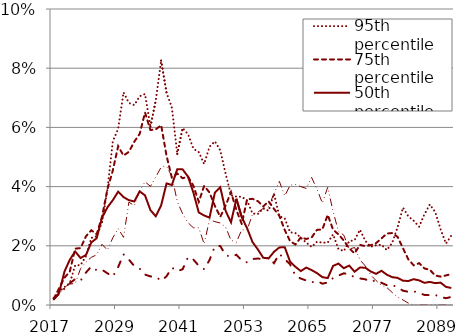
| Category | 95th percentile | 75th percentile | 50th percentile | 25th percentile | 5th percentile |
|---|---|---|---|---|---|
| 2017.0 | 0.002 | 0.002 | 0.002 | 0.002 | 0.002 |
| 2018.0 | 0.004 | 0.006 | 0.004 | 0.004 | 0.004 |
| 2019.0 | 0.006 | 0.009 | 0.011 | 0.006 | 0.006 |
| 2020.0 | 0.007 | 0.011 | 0.015 | 0.007 | 0.007 |
| 2021.0 | 0.013 | 0.019 | 0.018 | 0.009 | 0.007 |
| 2022.0 | 0.013 | 0.019 | 0.016 | 0.008 | 0.012 |
| 2023.0 | 0.016 | 0.023 | 0.017 | 0.011 | 0.014 |
| 2024.0 | 0.023 | 0.025 | 0.021 | 0.013 | 0.016 |
| 2025.0 | 0.023 | 0.024 | 0.023 | 0.012 | 0.017 |
| 2026.0 | 0.028 | 0.03 | 0.03 | 0.012 | 0.021 |
| 2027.0 | 0.039 | 0.039 | 0.033 | 0.011 | 0.019 |
| 2028.0 | 0.055 | 0.045 | 0.035 | 0.01 | 0.023 |
| 2029.0 | 0.06 | 0.054 | 0.038 | 0.013 | 0.026 |
| 2030.0 | 0.072 | 0.05 | 0.036 | 0.017 | 0.023 |
| 2031.0 | 0.068 | 0.052 | 0.035 | 0.015 | 0.035 |
| 2032.0 | 0.068 | 0.055 | 0.035 | 0.013 | 0.034 |
| 2033.0 | 0.071 | 0.058 | 0.038 | 0.012 | 0.039 |
| 2034.0 | 0.071 | 0.065 | 0.037 | 0.01 | 0.042 |
| 2035.0 | 0.06 | 0.059 | 0.032 | 0.01 | 0.04 |
| 2036.0 | 0.069 | 0.059 | 0.03 | 0.01 | 0.043 |
| 2037.0 | 0.083 | 0.061 | 0.034 | 0.008 | 0.047 |
| 2038.0 | 0.072 | 0.05 | 0.041 | 0.01 | 0.047 |
| 2039.0 | 0.067 | 0.043 | 0.041 | 0.013 | 0.043 |
| 2040.0 | 0.051 | 0.044 | 0.046 | 0.011 | 0.035 |
| 2041.0 | 0.06 | 0.043 | 0.046 | 0.012 | 0.031 |
| 2042.0 | 0.058 | 0.043 | 0.043 | 0.016 | 0.028 |
| 2043.0 | 0.053 | 0.04 | 0.038 | 0.015 | 0.026 |
| 2044.0 | 0.052 | 0.035 | 0.031 | 0.013 | 0.026 |
| 2045.0 | 0.048 | 0.04 | 0.03 | 0.012 | 0.021 |
| 2046.0 | 0.053 | 0.038 | 0.03 | 0.015 | 0.029 |
| 2047.0 | 0.055 | 0.033 | 0.038 | 0.02 | 0.028 |
| 2048.0 | 0.052 | 0.03 | 0.04 | 0.02 | 0.028 |
| 2049.0 | 0.044 | 0.034 | 0.032 | 0.017 | 0.026 |
| 2050.0 | 0.037 | 0.038 | 0.028 | 0.016 | 0.022 |
| 2051.0 | 0.037 | 0.032 | 0.036 | 0.017 | 0.021 |
| 2052.0 | 0.037 | 0.027 | 0.03 | 0.015 | 0.025 |
| 2053.0 | 0.035 | 0.036 | 0.026 | 0.014 | 0.025 |
| 2054.0 | 0.031 | 0.036 | 0.021 | 0.016 | 0.031 |
| 2055.0 | 0.031 | 0.035 | 0.019 | 0.016 | 0.031 |
| 2056.0 | 0.033 | 0.033 | 0.016 | 0.015 | 0.033 |
| 2057.0 | 0.032 | 0.035 | 0.016 | 0.016 | 0.033 |
| 2058.0 | 0.038 | 0.032 | 0.018 | 0.014 | 0.038 |
| 2059.0 | 0.03 | 0.03 | 0.019 | 0.017 | 0.042 |
| 2060.0 | 0.029 | 0.025 | 0.02 | 0.015 | 0.037 |
| 2061.0 | 0.025 | 0.022 | 0.015 | 0.014 | 0.04 |
| 2062.0 | 0.024 | 0.02 | 0.013 | 0.01 | 0.041 |
| 2063.0 | 0.023 | 0.023 | 0.011 | 0.009 | 0.04 |
| 2064.0 | 0.021 | 0.022 | 0.013 | 0.008 | 0.039 |
| 2065.0 | 0.02 | 0.023 | 0.012 | 0.008 | 0.043 |
| 2066.0 | 0.021 | 0.025 | 0.011 | 0.008 | 0.039 |
| 2067.0 | 0.021 | 0.026 | 0.009 | 0.007 | 0.034 |
| 2068.0 | 0.021 | 0.03 | 0.009 | 0.008 | 0.04 |
| 2069.0 | 0.024 | 0.025 | 0.013 | 0.009 | 0.032 |
| 2070.0 | 0.019 | 0.024 | 0.014 | 0.01 | 0.025 |
| 2071.0 | 0.018 | 0.022 | 0.012 | 0.011 | 0.024 |
| 2072.0 | 0.022 | 0.019 | 0.013 | 0.01 | 0.019 |
| 2073.0 | 0.022 | 0.017 | 0.011 | 0.009 | 0.019 |
| 2074.0 | 0.025 | 0.02 | 0.013 | 0.009 | 0.015 |
| 2075.0 | 0.022 | 0.02 | 0.013 | 0.009 | 0.013 |
| 2076.0 | 0.02 | 0.02 | 0.011 | 0.008 | 0.01 |
| 2077.0 | 0.02 | 0.021 | 0.011 | 0.008 | 0.008 |
| 2078.0 | 0.02 | 0.022 | 0.012 | 0.008 | 0.007 |
| 2079.0 | 0.019 | 0.024 | 0.01 | 0.007 | 0.006 |
| 2080.0 | 0.021 | 0.024 | 0.009 | 0.007 | 0.004 |
| 2081.0 | 0.026 | 0.023 | 0.009 | 0.006 | 0.003 |
| 2082.0 | 0.033 | 0.019 | 0.008 | 0.005 | 0.002 |
| 2083.0 | 0.03 | 0.015 | 0.008 | 0.004 | 0.001 |
| 2084.0 | 0.028 | 0.013 | 0.009 | 0.005 | 0 |
| 2085.0 | 0.026 | 0.014 | 0.008 | 0.004 | 0 |
| 2086.0 | 0.031 | 0.012 | 0.007 | 0.003 | 0 |
| 2087.0 | 0.034 | 0.012 | 0.008 | 0.003 | 0 |
| 2088.0 | 0.031 | 0.01 | 0.007 | 0.003 | 0 |
| 2089.0 | 0.026 | 0.01 | 0.008 | 0.003 | 0 |
| 2090.0 | 0.021 | 0.01 | 0.006 | 0.002 | 0 |
| 2091.0 | 0.023 | 0.01 | 0.006 | 0.003 | 0 |